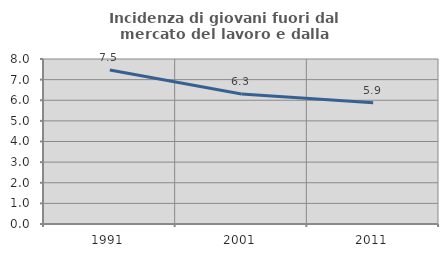
| Category | Incidenza di giovani fuori dal mercato del lavoro e dalla formazione  |
|---|---|
| 1991.0 | 7.466 |
| 2001.0 | 6.306 |
| 2011.0 | 5.873 |